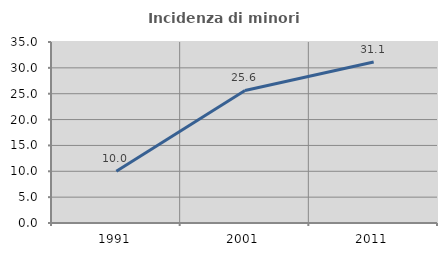
| Category | Incidenza di minori stranieri |
|---|---|
| 1991.0 | 10 |
| 2001.0 | 25.628 |
| 2011.0 | 31.122 |